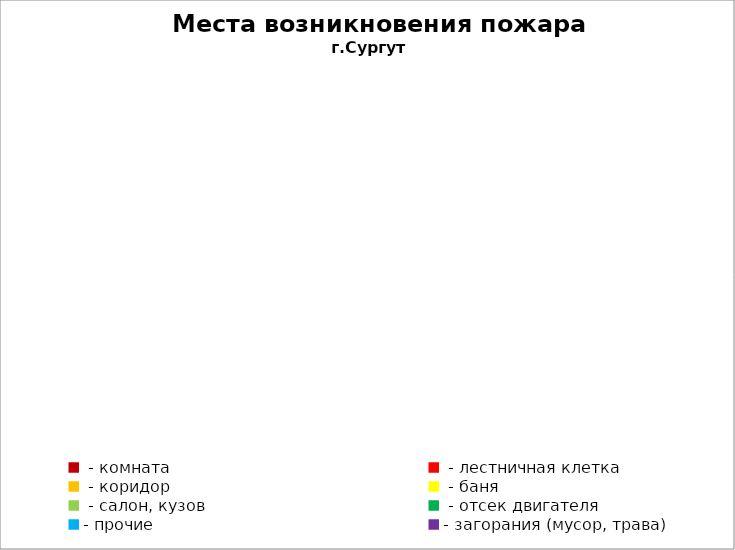
| Category | Места возникновения пожара |
|---|---|
|  - комната | 50 |
|  - лестничная клетка | 5 |
|  - коридор | 4 |
|  - баня | 23 |
|  - салон, кузов | 11 |
|  - отсек двигателя | 29 |
| - прочие | 72 |
| - загорания (мусор, трава)  | 40 |